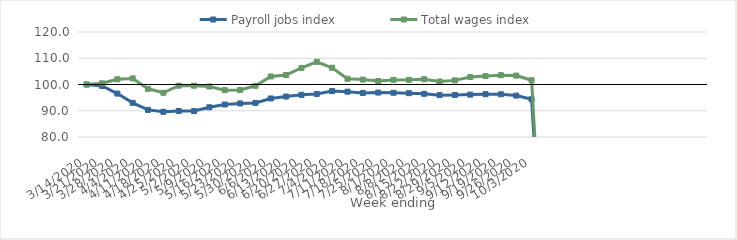
| Category | Payroll jobs index | Total wages index |
|---|---|---|
| 14/03/2020 | 100 | 100 |
| 21/03/2020 | 99.462 | 100.458 |
| 28/03/2020 | 96.539 | 101.983 |
| 04/04/2020 | 93.027 | 102.312 |
| 11/04/2020 | 90.336 | 98.358 |
| 18/04/2020 | 89.607 | 96.851 |
| 25/04/2020 | 89.897 | 99.562 |
| 02/05/2020 | 89.876 | 99.543 |
| 09/05/2020 | 91.321 | 99.231 |
| 16/05/2020 | 92.375 | 97.848 |
| 23/05/2020 | 92.78 | 97.88 |
| 30/05/2020 | 92.976 | 99.498 |
| 06/06/2020 | 94.684 | 103.075 |
| 13/06/2020 | 95.413 | 103.599 |
| 20/06/2020 | 96.07 | 106.306 |
| 27/06/2020 | 96.414 | 108.635 |
| 04/07/2020 | 97.503 | 106.379 |
| 11/07/2020 | 97.264 | 102.187 |
| 18/07/2020 | 96.778 | 101.877 |
| 25/07/2020 | 96.921 | 101.337 |
| 01/08/2020 | 96.856 | 101.757 |
| 08/08/2020 | 96.691 | 101.783 |
| 15/08/2020 | 96.452 | 102.017 |
| 22/08/2020 | 95.947 | 101.133 |
| 29/08/2020 | 96.034 | 101.567 |
| 05/09/2020 | 96.145 | 102.842 |
| 12/09/2020 | 96.306 | 103.211 |
| 19/09/2020 | 96.277 | 103.558 |
| 26/09/2020 | 95.768 | 103.4 |
| 03/10/2020 | 94.404 | 101.619 |